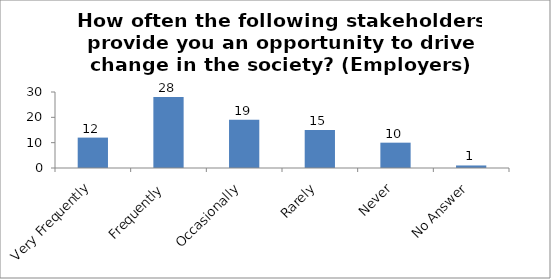
| Category | How often the following stakeholders provide you an opportunity to drive change in the society? (Employers) |
|---|---|
| Very Frequently | 12 |
| Frequently | 28 |
| Occasionally | 19 |
| Rarely | 15 |
| Never | 10 |
| No Answer | 1 |